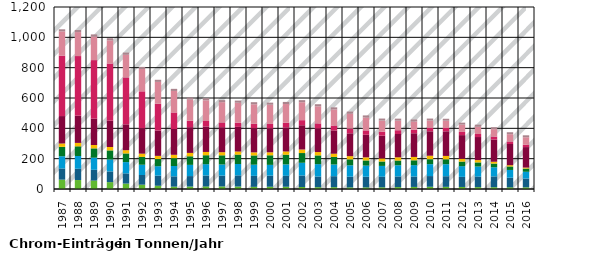
| Category | atmosphärische Deposition auf Gewässerflächen | Erosion | Grundwasser | Oberflächenabfluss | Drainagen | urbane Gebiete (Kanalisationssysteme) | industrielle Direkteinleiter | kommunale Kläranlagen | historischer Bergbau |
|---|---|---|---|---|---|---|---|---|---|
| 1987.0 | 61.474 | 73.614 | 81.019 | 61.78 | 22.267 | 180.653 | 398.491 | 159.803 | 13.93 |
| 1988.0 | 59.073 | 74.508 | 83.839 | 63.914 | 22.536 | 179.468 | 393.155 | 158.021 | 13.93 |
| 1989.0 | 55.873 | 70.628 | 80.151 | 61.26 | 22.242 | 173.589 | 386.04 | 155.645 | 13.93 |
| 1990.0 | 45.272 | 70.796 | 78.555 | 59.962 | 22.494 | 173.243 | 377.147 | 152.735 | 13.93 |
| 1991.0 | 35.577 | 67.044 | 74.785 | 57.205 | 21.372 | 169.429 | 310.124 | 149.887 | 13.93 |
| 1992.0 | 28.362 | 64.076 | 67.534 | 51.758 | 21.524 | 167.665 | 243.101 | 147.099 | 13.93 |
| 1993.0 | 21.604 | 66.433 | 62.127 | 47.43 | 20.743 | 167.389 | 176.078 | 144.373 | 13.93 |
| 1994.0 | 15.447 | 68.146 | 67.963 | 51.786 | 22.098 | 170.236 | 109.054 | 141.707 | 13.93 |
| 1995.0 | 16.13 | 68.939 | 74.099 | 56.558 | 22.283 | 169.474 | 42.576 | 139.042 | 13.93 |
| 1996.0 | 16.812 | 72.283 | 74.426 | 59.245 | 21.509 | 168.097 | 35.947 | 136.412 | 13.93 |
| 1997.0 | 16.848 | 71.427 | 73.464 | 60.467 | 20.577 | 164.709 | 31.097 | 133.817 | 13.93 |
| 1998.0 | 16.283 | 73.017 | 75.494 | 61.799 | 20.597 | 162.573 | 28.026 | 131.257 | 13.93 |
| 1999.0 | 14.442 | 72.218 | 73.825 | 60.961 | 20.114 | 159.739 | 28.438 | 128.732 | 13.93 |
| 2000.0 | 14.879 | 73.17 | 71.105 | 63.212 | 19.629 | 157.164 | 30.085 | 126.243 | 13.93 |
| 2001.0 | 14.775 | 72.336 | 74.958 | 63.886 | 21.719 | 158.018 | 31.79 | 122.719 | 13.93 |
| 2002.0 | 13.335 | 75.912 | 83.869 | 63.99 | 23.421 | 159.82 | 33.495 | 118.159 | 13.93 |
| 2003.0 | 12.045 | 70.442 | 81.371 | 57.739 | 21.988 | 154.947 | 33.992 | 112.565 | 13.93 |
| 2004.0 | 12.228 | 71.985 | 77.239 | 49.848 | 21.506 | 152.838 | 32.784 | 105.935 | 13.93 |
| 2005.0 | 10.695 | 70.63 | 74.896 | 39.159 | 21.287 | 149.989 | 31.576 | 98.27 | 13.93 |
| 2006.0 | 10.837 | 69.969 | 73.823 | 33.663 | 20.458 | 148.812 | 28.906 | 84.991 | 13.738 |
| 2007.0 | 11.277 | 69.97 | 71.022 | 29.236 | 20.24 | 149.711 | 26.236 | 73.244 | 13.545 |
| 2008.0 | 12.661 | 70.416 | 73.378 | 31.041 | 21.742 | 153.445 | 24.882 | 63.03 | 13.353 |
| 2009.0 | 13.643 | 68.843 | 74.691 | 32.103 | 22.03 | 156.322 | 22.981 | 54.474 | 13.161 |
| 2010.0 | 14.735 | 70.452 | 78.522 | 32.842 | 22.7 | 161.041 | 23.663 | 47.576 | 12.969 |
| 2011.0 | 14.174 | 70.165 | 79.144 | 32.47 | 22.168 | 161.966 | 22.263 | 47.826 | 12.969 |
| 2012.0 | 13.379 | 66.578 | 70.517 | 30.309 | 18.479 | 156.007 | 21.043 | 48.184 | 12.969 |
| 2013.0 | 12.486 | 69.342 | 66.19 | 27.444 | 15.28 | 151.878 | 19.967 | 48.543 | 12.969 |
| 2014.0 | 11.993 | 71.201 | 59.963 | 24.614 | 11.95 | 146.481 | 19.438 | 48.777 | 12.969 |
| 2015.0 | 11.341 | 63.1 | 51.185 | 22.822 | 8.604 | 139.639 | 16.276 | 48.391 | 12.969 |
| 2016.0 | 11.154 | 57.901 | 44.84 | 20.664 | 6.559 | 135.143 | 16.199 | 48.612 | 12.969 |